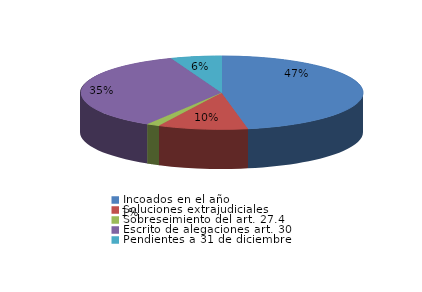
| Category | Series 0 |
|---|---|
| Incoados en el año | 220 |
| Soluciones extrajudiciales | 48 |
| Sobreseimiento del art. 27.4 | 7 |
| Escrito de alegaciones art. 30 | 166 |
| Pendientes a 31 de diciembre | 27 |